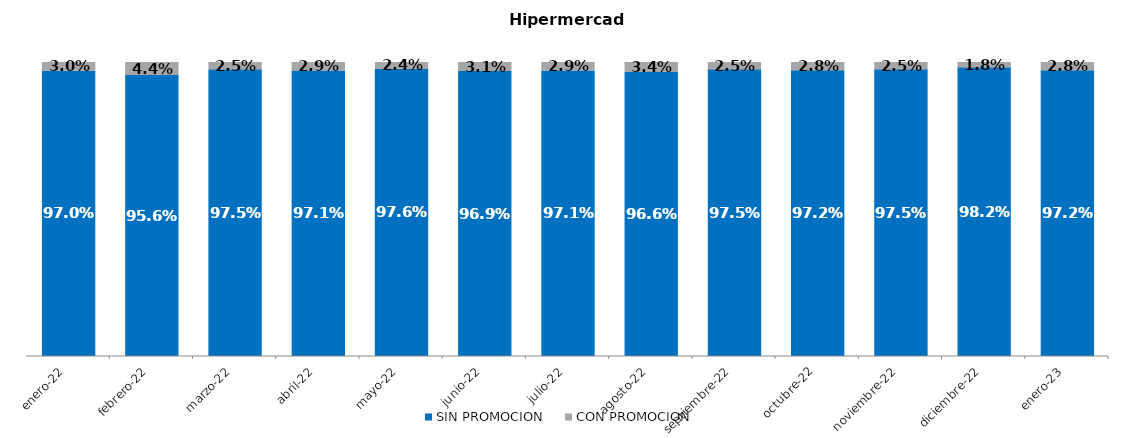
| Category | SIN PROMOCION   | CON PROMOCION   |
|---|---|---|
| 2022-01-01 | 0.97 | 0.03 |
| 2022-02-01 | 0.956 | 0.044 |
| 2022-03-01 | 0.975 | 0.025 |
| 2022-04-01 | 0.971 | 0.029 |
| 2022-05-01 | 0.976 | 0.024 |
| 2022-06-01 | 0.969 | 0.031 |
| 2022-07-01 | 0.971 | 0.029 |
| 2022-08-01 | 0.966 | 0.034 |
| 2022-09-01 | 0.975 | 0.025 |
| 2022-10-01 | 0.972 | 0.028 |
| 2022-11-01 | 0.975 | 0.025 |
| 2022-12-01 | 0.982 | 0.018 |
| 2023-01-01 | 0.972 | 0.028 |